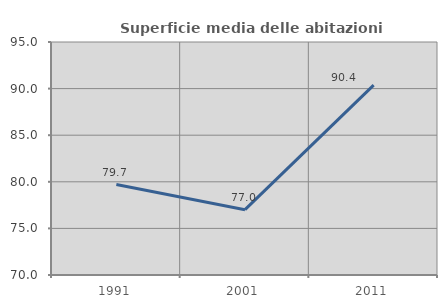
| Category | Superficie media delle abitazioni occupate |
|---|---|
| 1991.0 | 79.709 |
| 2001.0 | 77.009 |
| 2011.0 | 90.368 |